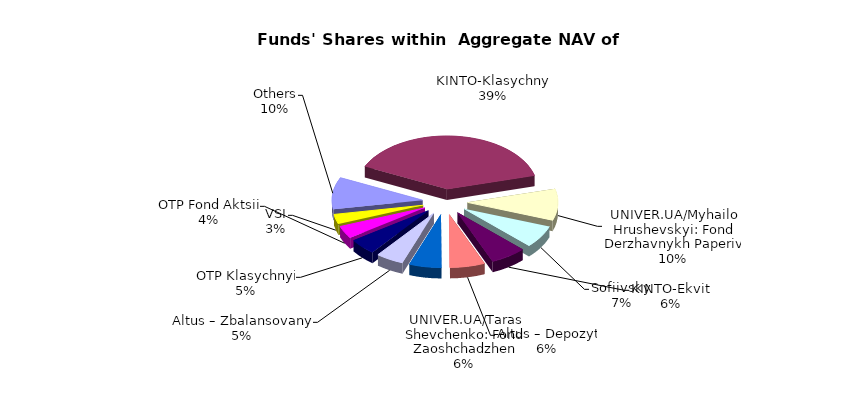
| Category | Series 0 | Series 1 |
|---|---|---|
| Others | 5301670.06 | 0.095 |
| KINTO-Klasychnyi | 21215566.52 | 0.379 |
| UNIVER.UA/Myhailo Hrushevskyi: Fond Derzhavnykh Paperiv | 5225388.65 | 0.093 |
| Sofiivskyi | 3701294.985 | 0.066 |
| KINTO-Ekviti | 3491759.75 | 0.062 |
| Altus – Depozyt | 3406578.03 | 0.061 |
| UNIVER.UA/Taras Shevchenko: Fond Zaoshchadzhen | 3118888.8 | 0.056 |
| Altus – Zbalansovanyi | 2706117.77 | 0.048 |
| ОТP Klasychnyi | 2643690.53 | 0.047 |
| OTP Fond Aktsii | 2066517.02 | 0.037 |
| VSI | 1621003.95 | 0.029 |